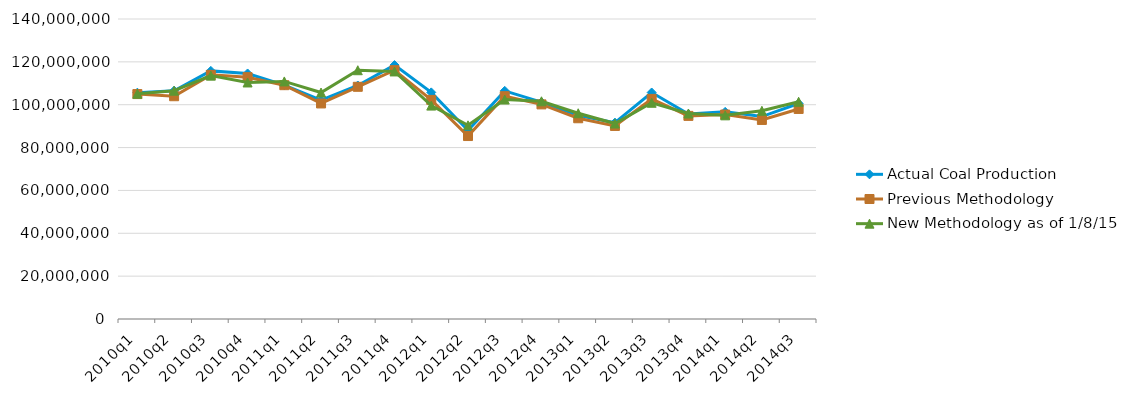
| Category | Actual Coal Production | Previous Methodology | New Methodology as of 1/8/15 |
|---|---|---|---|
| 2010q1 | 105619140 | 104966164 | 105123302 |
| 2010q2 | 106537577 | 103963186 | 106532651 |
| 2010q3 | 115785936 | 113937512 | 113572234 |
| 2010q4 | 114579719 | 112854214 | 110375658 |
| 2011q1 | 109084641 | 109117716 | 110867458 |
| 2011q2 | 102122674 | 100584813 | 105692070 |
| 2011q3 | 108964784 | 108361277 | 116097097 |
| 2011q4 | 118501289 | 116114756 | 115522083 |
| 2012q1 | 105754949 | 102248841 | 99584894 |
| 2012q2 | 88003896 | 85379269 | 90373240 |
| 2012q3 | 106466056 | 103981105 | 102411438 |
| 2012q4 | 101216710 | 100148578 | 101603072 |
| 2013q1 | 94926180 | 93682497 | 96011674 |
| 2013q2 | 91629552 | 90091396 | 91214030 |
| 2013q3 | 105704344 | 102711767 | 100903250 |
| 2013q4 | 95663752 | 94784873 | 95895587 |
| 2014q1 | 96659563 | 95417859 | 95040048 |
| 2014q2 | 94464819 | 92894463 | 97155862 |
| 2014q3 | 100577819 | 98022763 | 101383254 |